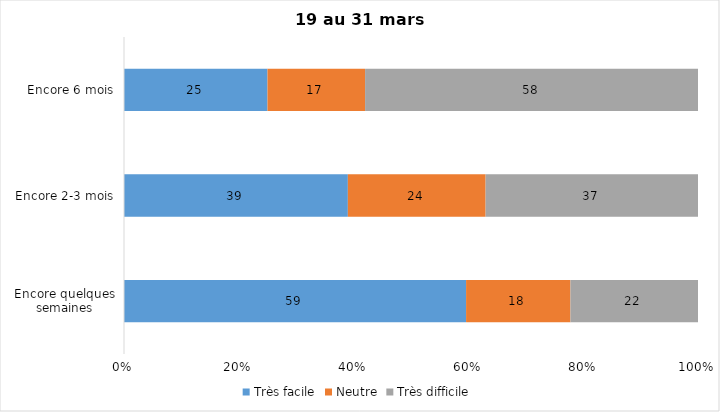
| Category | Très facile | Neutre | Très difficile |
|---|---|---|---|
| Encore quelques semaines | 59 | 18 | 22 |
| Encore 2-3 mois | 39 | 24 | 37 |
| Encore 6 mois | 25 | 17 | 58 |